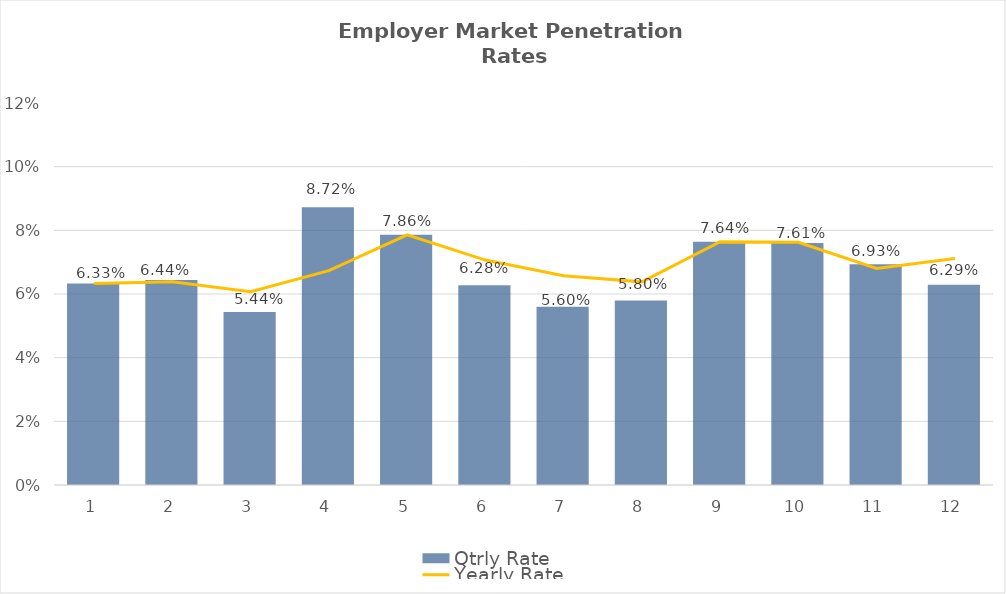
| Category | Qtrly Rate |
|---|---|
| 0 | 0.063 |
| 1 | 0.064 |
| 2 | 0.054 |
| 3 | 0.087 |
| 4 | 0.079 |
| 5 | 0.063 |
| 6 | 0.056 |
| 7 | 0.058 |
| 8 | 0.076 |
| 9 | 0.076 |
| 10 | 0.069 |
| 11 | 0.063 |